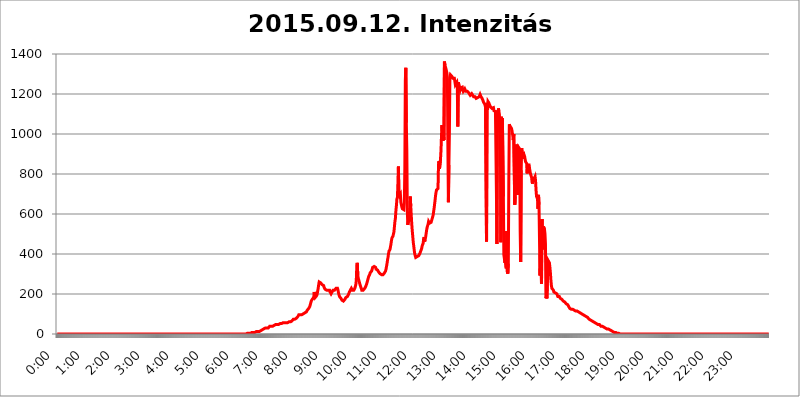
| Category | 2015.09.12. Intenzitás [W/m^2] |
|---|---|
| 0.0 | 0 |
| 0.0006944444444444445 | 0 |
| 0.001388888888888889 | 0 |
| 0.0020833333333333333 | 0 |
| 0.002777777777777778 | 0 |
| 0.003472222222222222 | 0 |
| 0.004166666666666667 | 0 |
| 0.004861111111111111 | 0 |
| 0.005555555555555556 | 0 |
| 0.0062499999999999995 | 0 |
| 0.006944444444444444 | 0 |
| 0.007638888888888889 | 0 |
| 0.008333333333333333 | 0 |
| 0.009027777777777779 | 0 |
| 0.009722222222222222 | 0 |
| 0.010416666666666666 | 0 |
| 0.011111111111111112 | 0 |
| 0.011805555555555555 | 0 |
| 0.012499999999999999 | 0 |
| 0.013194444444444444 | 0 |
| 0.013888888888888888 | 0 |
| 0.014583333333333332 | 0 |
| 0.015277777777777777 | 0 |
| 0.015972222222222224 | 0 |
| 0.016666666666666666 | 0 |
| 0.017361111111111112 | 0 |
| 0.018055555555555557 | 0 |
| 0.01875 | 0 |
| 0.019444444444444445 | 0 |
| 0.02013888888888889 | 0 |
| 0.020833333333333332 | 0 |
| 0.02152777777777778 | 0 |
| 0.022222222222222223 | 0 |
| 0.02291666666666667 | 0 |
| 0.02361111111111111 | 0 |
| 0.024305555555555556 | 0 |
| 0.024999999999999998 | 0 |
| 0.025694444444444447 | 0 |
| 0.02638888888888889 | 0 |
| 0.027083333333333334 | 0 |
| 0.027777777777777776 | 0 |
| 0.02847222222222222 | 0 |
| 0.029166666666666664 | 0 |
| 0.029861111111111113 | 0 |
| 0.030555555555555555 | 0 |
| 0.03125 | 0 |
| 0.03194444444444445 | 0 |
| 0.03263888888888889 | 0 |
| 0.03333333333333333 | 0 |
| 0.034027777777777775 | 0 |
| 0.034722222222222224 | 0 |
| 0.035416666666666666 | 0 |
| 0.036111111111111115 | 0 |
| 0.03680555555555556 | 0 |
| 0.0375 | 0 |
| 0.03819444444444444 | 0 |
| 0.03888888888888889 | 0 |
| 0.03958333333333333 | 0 |
| 0.04027777777777778 | 0 |
| 0.04097222222222222 | 0 |
| 0.041666666666666664 | 0 |
| 0.042361111111111106 | 0 |
| 0.04305555555555556 | 0 |
| 0.043750000000000004 | 0 |
| 0.044444444444444446 | 0 |
| 0.04513888888888889 | 0 |
| 0.04583333333333334 | 0 |
| 0.04652777777777778 | 0 |
| 0.04722222222222222 | 0 |
| 0.04791666666666666 | 0 |
| 0.04861111111111111 | 0 |
| 0.049305555555555554 | 0 |
| 0.049999999999999996 | 0 |
| 0.05069444444444445 | 0 |
| 0.051388888888888894 | 0 |
| 0.052083333333333336 | 0 |
| 0.05277777777777778 | 0 |
| 0.05347222222222222 | 0 |
| 0.05416666666666667 | 0 |
| 0.05486111111111111 | 0 |
| 0.05555555555555555 | 0 |
| 0.05625 | 0 |
| 0.05694444444444444 | 0 |
| 0.057638888888888885 | 0 |
| 0.05833333333333333 | 0 |
| 0.05902777777777778 | 0 |
| 0.059722222222222225 | 0 |
| 0.06041666666666667 | 0 |
| 0.061111111111111116 | 0 |
| 0.06180555555555556 | 0 |
| 0.0625 | 0 |
| 0.06319444444444444 | 0 |
| 0.06388888888888888 | 0 |
| 0.06458333333333334 | 0 |
| 0.06527777777777778 | 0 |
| 0.06597222222222222 | 0 |
| 0.06666666666666667 | 0 |
| 0.06736111111111111 | 0 |
| 0.06805555555555555 | 0 |
| 0.06874999999999999 | 0 |
| 0.06944444444444443 | 0 |
| 0.07013888888888889 | 0 |
| 0.07083333333333333 | 0 |
| 0.07152777777777779 | 0 |
| 0.07222222222222223 | 0 |
| 0.07291666666666667 | 0 |
| 0.07361111111111111 | 0 |
| 0.07430555555555556 | 0 |
| 0.075 | 0 |
| 0.07569444444444444 | 0 |
| 0.0763888888888889 | 0 |
| 0.07708333333333334 | 0 |
| 0.07777777777777778 | 0 |
| 0.07847222222222222 | 0 |
| 0.07916666666666666 | 0 |
| 0.0798611111111111 | 0 |
| 0.08055555555555556 | 0 |
| 0.08125 | 0 |
| 0.08194444444444444 | 0 |
| 0.08263888888888889 | 0 |
| 0.08333333333333333 | 0 |
| 0.08402777777777777 | 0 |
| 0.08472222222222221 | 0 |
| 0.08541666666666665 | 0 |
| 0.08611111111111112 | 0 |
| 0.08680555555555557 | 0 |
| 0.08750000000000001 | 0 |
| 0.08819444444444445 | 0 |
| 0.08888888888888889 | 0 |
| 0.08958333333333333 | 0 |
| 0.09027777777777778 | 0 |
| 0.09097222222222222 | 0 |
| 0.09166666666666667 | 0 |
| 0.09236111111111112 | 0 |
| 0.09305555555555556 | 0 |
| 0.09375 | 0 |
| 0.09444444444444444 | 0 |
| 0.09513888888888888 | 0 |
| 0.09583333333333333 | 0 |
| 0.09652777777777777 | 0 |
| 0.09722222222222222 | 0 |
| 0.09791666666666667 | 0 |
| 0.09861111111111111 | 0 |
| 0.09930555555555555 | 0 |
| 0.09999999999999999 | 0 |
| 0.10069444444444443 | 0 |
| 0.1013888888888889 | 0 |
| 0.10208333333333335 | 0 |
| 0.10277777777777779 | 0 |
| 0.10347222222222223 | 0 |
| 0.10416666666666667 | 0 |
| 0.10486111111111111 | 0 |
| 0.10555555555555556 | 0 |
| 0.10625 | 0 |
| 0.10694444444444444 | 0 |
| 0.1076388888888889 | 0 |
| 0.10833333333333334 | 0 |
| 0.10902777777777778 | 0 |
| 0.10972222222222222 | 0 |
| 0.1111111111111111 | 0 |
| 0.11180555555555556 | 0 |
| 0.11180555555555556 | 0 |
| 0.1125 | 0 |
| 0.11319444444444444 | 0 |
| 0.11388888888888889 | 0 |
| 0.11458333333333333 | 0 |
| 0.11527777777777777 | 0 |
| 0.11597222222222221 | 0 |
| 0.11666666666666665 | 0 |
| 0.1173611111111111 | 0 |
| 0.11805555555555557 | 0 |
| 0.11944444444444445 | 0 |
| 0.12013888888888889 | 0 |
| 0.12083333333333333 | 0 |
| 0.12152777777777778 | 0 |
| 0.12222222222222223 | 0 |
| 0.12291666666666667 | 0 |
| 0.12291666666666667 | 0 |
| 0.12361111111111112 | 0 |
| 0.12430555555555556 | 0 |
| 0.125 | 0 |
| 0.12569444444444444 | 0 |
| 0.12638888888888888 | 0 |
| 0.12708333333333333 | 0 |
| 0.16875 | 0 |
| 0.12847222222222224 | 0 |
| 0.12916666666666668 | 0 |
| 0.12986111111111112 | 0 |
| 0.13055555555555556 | 0 |
| 0.13125 | 0 |
| 0.13194444444444445 | 0 |
| 0.1326388888888889 | 0 |
| 0.13333333333333333 | 0 |
| 0.13402777777777777 | 0 |
| 0.13402777777777777 | 0 |
| 0.13472222222222222 | 0 |
| 0.13541666666666666 | 0 |
| 0.1361111111111111 | 0 |
| 0.13749999999999998 | 0 |
| 0.13819444444444443 | 0 |
| 0.1388888888888889 | 0 |
| 0.13958333333333334 | 0 |
| 0.14027777777777778 | 0 |
| 0.14097222222222222 | 0 |
| 0.14166666666666666 | 0 |
| 0.1423611111111111 | 0 |
| 0.14305555555555557 | 0 |
| 0.14375000000000002 | 0 |
| 0.14444444444444446 | 0 |
| 0.1451388888888889 | 0 |
| 0.1451388888888889 | 0 |
| 0.14652777777777778 | 0 |
| 0.14722222222222223 | 0 |
| 0.14791666666666667 | 0 |
| 0.1486111111111111 | 0 |
| 0.14930555555555555 | 0 |
| 0.15 | 0 |
| 0.15069444444444444 | 0 |
| 0.15138888888888888 | 0 |
| 0.15208333333333332 | 0 |
| 0.15277777777777776 | 0 |
| 0.15347222222222223 | 0 |
| 0.15416666666666667 | 0 |
| 0.15486111111111112 | 0 |
| 0.15555555555555556 | 0 |
| 0.15625 | 0 |
| 0.15694444444444444 | 0 |
| 0.15763888888888888 | 0 |
| 0.15833333333333333 | 0 |
| 0.15902777777777777 | 0 |
| 0.15972222222222224 | 0 |
| 0.16041666666666668 | 0 |
| 0.16111111111111112 | 0 |
| 0.16180555555555556 | 0 |
| 0.1625 | 0 |
| 0.16319444444444445 | 0 |
| 0.1638888888888889 | 0 |
| 0.16458333333333333 | 0 |
| 0.16527777777777777 | 0 |
| 0.16597222222222222 | 0 |
| 0.16666666666666666 | 0 |
| 0.1673611111111111 | 0 |
| 0.16805555555555554 | 0 |
| 0.16874999999999998 | 0 |
| 0.16944444444444443 | 0 |
| 0.17013888888888887 | 0 |
| 0.1708333333333333 | 0 |
| 0.17152777777777775 | 0 |
| 0.17222222222222225 | 0 |
| 0.1729166666666667 | 0 |
| 0.17361111111111113 | 0 |
| 0.17430555555555557 | 0 |
| 0.17500000000000002 | 0 |
| 0.17569444444444446 | 0 |
| 0.1763888888888889 | 0 |
| 0.17708333333333334 | 0 |
| 0.17777777777777778 | 0 |
| 0.17847222222222223 | 0 |
| 0.17916666666666667 | 0 |
| 0.1798611111111111 | 0 |
| 0.18055555555555555 | 0 |
| 0.18125 | 0 |
| 0.18194444444444444 | 0 |
| 0.1826388888888889 | 0 |
| 0.18333333333333335 | 0 |
| 0.1840277777777778 | 0 |
| 0.18472222222222223 | 0 |
| 0.18541666666666667 | 0 |
| 0.18611111111111112 | 0 |
| 0.18680555555555556 | 0 |
| 0.1875 | 0 |
| 0.18819444444444444 | 0 |
| 0.18888888888888888 | 0 |
| 0.18958333333333333 | 0 |
| 0.19027777777777777 | 0 |
| 0.1909722222222222 | 0 |
| 0.19166666666666665 | 0 |
| 0.19236111111111112 | 0 |
| 0.19305555555555554 | 0 |
| 0.19375 | 0 |
| 0.19444444444444445 | 0 |
| 0.1951388888888889 | 0 |
| 0.19583333333333333 | 0 |
| 0.19652777777777777 | 0 |
| 0.19722222222222222 | 0 |
| 0.19791666666666666 | 0 |
| 0.1986111111111111 | 0 |
| 0.19930555555555554 | 0 |
| 0.19999999999999998 | 0 |
| 0.20069444444444443 | 0 |
| 0.20138888888888887 | 0 |
| 0.2020833333333333 | 0 |
| 0.2027777777777778 | 0 |
| 0.2034722222222222 | 0 |
| 0.2041666666666667 | 0 |
| 0.20486111111111113 | 0 |
| 0.20555555555555557 | 0 |
| 0.20625000000000002 | 0 |
| 0.20694444444444446 | 0 |
| 0.2076388888888889 | 0 |
| 0.20833333333333334 | 0 |
| 0.20902777777777778 | 0 |
| 0.20972222222222223 | 0 |
| 0.21041666666666667 | 0 |
| 0.2111111111111111 | 0 |
| 0.21180555555555555 | 0 |
| 0.2125 | 0 |
| 0.21319444444444444 | 0 |
| 0.2138888888888889 | 0 |
| 0.21458333333333335 | 0 |
| 0.2152777777777778 | 0 |
| 0.21597222222222223 | 0 |
| 0.21666666666666667 | 0 |
| 0.21736111111111112 | 0 |
| 0.21805555555555556 | 0 |
| 0.21875 | 0 |
| 0.21944444444444444 | 0 |
| 0.22013888888888888 | 0 |
| 0.22083333333333333 | 0 |
| 0.22152777777777777 | 0 |
| 0.2222222222222222 | 0 |
| 0.22291666666666665 | 0 |
| 0.2236111111111111 | 0 |
| 0.22430555555555556 | 0 |
| 0.225 | 0 |
| 0.22569444444444445 | 0 |
| 0.2263888888888889 | 0 |
| 0.22708333333333333 | 0 |
| 0.22777777777777777 | 0 |
| 0.22847222222222222 | 0 |
| 0.22916666666666666 | 0 |
| 0.2298611111111111 | 0 |
| 0.23055555555555554 | 0 |
| 0.23124999999999998 | 0 |
| 0.23194444444444443 | 0 |
| 0.23263888888888887 | 0 |
| 0.2333333333333333 | 0 |
| 0.2340277777777778 | 0 |
| 0.2347222222222222 | 0 |
| 0.2354166666666667 | 0 |
| 0.23611111111111113 | 0 |
| 0.23680555555555557 | 0 |
| 0.23750000000000002 | 0 |
| 0.23819444444444446 | 0 |
| 0.2388888888888889 | 0 |
| 0.23958333333333334 | 0 |
| 0.24027777777777778 | 0 |
| 0.24097222222222223 | 0 |
| 0.24166666666666667 | 0 |
| 0.2423611111111111 | 0 |
| 0.24305555555555555 | 0 |
| 0.24375 | 0 |
| 0.24444444444444446 | 0 |
| 0.24513888888888888 | 0 |
| 0.24583333333333335 | 0 |
| 0.2465277777777778 | 0 |
| 0.24722222222222223 | 0 |
| 0.24791666666666667 | 0 |
| 0.24861111111111112 | 0 |
| 0.24930555555555556 | 0 |
| 0.25 | 0 |
| 0.25069444444444444 | 0 |
| 0.2513888888888889 | 0 |
| 0.2520833333333333 | 0 |
| 0.25277777777777777 | 0 |
| 0.2534722222222222 | 0 |
| 0.25416666666666665 | 0 |
| 0.2548611111111111 | 0 |
| 0.2555555555555556 | 0 |
| 0.25625000000000003 | 0 |
| 0.2569444444444445 | 0 |
| 0.2576388888888889 | 0 |
| 0.25833333333333336 | 0 |
| 0.2590277777777778 | 0 |
| 0.25972222222222224 | 0 |
| 0.2604166666666667 | 0 |
| 0.2611111111111111 | 0 |
| 0.26180555555555557 | 0 |
| 0.2625 | 0 |
| 0.26319444444444445 | 0 |
| 0.2638888888888889 | 0 |
| 0.26458333333333334 | 0 |
| 0.2652777777777778 | 0 |
| 0.2659722222222222 | 3.525 |
| 0.26666666666666666 | 3.525 |
| 0.2673611111111111 | 3.525 |
| 0.26805555555555555 | 3.525 |
| 0.26875 | 3.525 |
| 0.26944444444444443 | 3.525 |
| 0.2701388888888889 | 3.525 |
| 0.2708333333333333 | 3.525 |
| 0.27152777777777776 | 7.887 |
| 0.2722222222222222 | 7.887 |
| 0.27291666666666664 | 7.887 |
| 0.2736111111111111 | 7.887 |
| 0.2743055555555555 | 7.887 |
| 0.27499999999999997 | 7.887 |
| 0.27569444444444446 | 7.887 |
| 0.27638888888888885 | 7.887 |
| 0.27708333333333335 | 7.887 |
| 0.2777777777777778 | 12.257 |
| 0.27847222222222223 | 12.257 |
| 0.2791666666666667 | 12.257 |
| 0.2798611111111111 | 12.257 |
| 0.28055555555555556 | 12.257 |
| 0.28125 | 12.257 |
| 0.28194444444444444 | 12.257 |
| 0.2826388888888889 | 12.257 |
| 0.2833333333333333 | 12.257 |
| 0.28402777777777777 | 12.257 |
| 0.2847222222222222 | 16.636 |
| 0.28541666666666665 | 16.636 |
| 0.28611111111111115 | 21.024 |
| 0.28680555555555554 | 21.024 |
| 0.28750000000000003 | 21.024 |
| 0.2881944444444445 | 21.024 |
| 0.2888888888888889 | 25.419 |
| 0.28958333333333336 | 25.419 |
| 0.2902777777777778 | 25.419 |
| 0.29097222222222224 | 25.419 |
| 0.2916666666666667 | 29.823 |
| 0.2923611111111111 | 29.823 |
| 0.29305555555555557 | 29.823 |
| 0.29375 | 29.823 |
| 0.29444444444444445 | 29.823 |
| 0.2951388888888889 | 29.823 |
| 0.29583333333333334 | 29.823 |
| 0.2965277777777778 | 29.823 |
| 0.2972222222222222 | 34.234 |
| 0.29791666666666666 | 38.653 |
| 0.2986111111111111 | 38.653 |
| 0.29930555555555555 | 38.653 |
| 0.3 | 38.653 |
| 0.30069444444444443 | 38.653 |
| 0.3013888888888889 | 38.653 |
| 0.3020833333333333 | 38.653 |
| 0.30277777777777776 | 38.653 |
| 0.3034722222222222 | 43.079 |
| 0.30416666666666664 | 43.079 |
| 0.3048611111111111 | 47.511 |
| 0.3055555555555555 | 47.511 |
| 0.30624999999999997 | 47.511 |
| 0.3069444444444444 | 47.511 |
| 0.3076388888888889 | 47.511 |
| 0.30833333333333335 | 47.511 |
| 0.3090277777777778 | 47.511 |
| 0.30972222222222223 | 47.511 |
| 0.3104166666666667 | 47.511 |
| 0.3111111111111111 | 47.511 |
| 0.31180555555555556 | 47.511 |
| 0.3125 | 51.951 |
| 0.31319444444444444 | 51.951 |
| 0.3138888888888889 | 51.951 |
| 0.3145833333333333 | 51.951 |
| 0.31527777777777777 | 56.398 |
| 0.3159722222222222 | 56.398 |
| 0.31666666666666665 | 56.398 |
| 0.31736111111111115 | 56.398 |
| 0.31805555555555554 | 60.85 |
| 0.31875000000000003 | 56.398 |
| 0.3194444444444445 | 56.398 |
| 0.3201388888888889 | 56.398 |
| 0.32083333333333336 | 56.398 |
| 0.3215277777777778 | 56.398 |
| 0.32222222222222224 | 56.398 |
| 0.3229166666666667 | 56.398 |
| 0.3236111111111111 | 56.398 |
| 0.32430555555555557 | 60.85 |
| 0.325 | 60.85 |
| 0.32569444444444445 | 60.85 |
| 0.3263888888888889 | 60.85 |
| 0.32708333333333334 | 60.85 |
| 0.3277777777777778 | 60.85 |
| 0.3284722222222222 | 65.31 |
| 0.32916666666666666 | 65.31 |
| 0.3298611111111111 | 69.775 |
| 0.33055555555555555 | 69.775 |
| 0.33125 | 74.246 |
| 0.33194444444444443 | 74.246 |
| 0.3326388888888889 | 74.246 |
| 0.3333333333333333 | 74.246 |
| 0.3340277777777778 | 78.722 |
| 0.3347222222222222 | 78.722 |
| 0.3354166666666667 | 78.722 |
| 0.3361111111111111 | 83.205 |
| 0.3368055555555556 | 83.205 |
| 0.33749999999999997 | 87.692 |
| 0.33819444444444446 | 92.184 |
| 0.33888888888888885 | 96.682 |
| 0.33958333333333335 | 96.682 |
| 0.34027777777777773 | 96.682 |
| 0.34097222222222223 | 96.682 |
| 0.3416666666666666 | 96.682 |
| 0.3423611111111111 | 96.682 |
| 0.3430555555555555 | 96.682 |
| 0.34375 | 96.682 |
| 0.3444444444444445 | 96.682 |
| 0.3451388888888889 | 101.184 |
| 0.3458333333333334 | 101.184 |
| 0.34652777777777777 | 101.184 |
| 0.34722222222222227 | 105.69 |
| 0.34791666666666665 | 105.69 |
| 0.34861111111111115 | 110.201 |
| 0.34930555555555554 | 110.201 |
| 0.35000000000000003 | 114.716 |
| 0.3506944444444444 | 119.235 |
| 0.3513888888888889 | 119.235 |
| 0.3520833333333333 | 123.758 |
| 0.3527777777777778 | 128.284 |
| 0.3534722222222222 | 128.284 |
| 0.3541666666666667 | 137.347 |
| 0.3548611111111111 | 146.423 |
| 0.35555555555555557 | 155.509 |
| 0.35625 | 164.605 |
| 0.35694444444444445 | 169.156 |
| 0.3576388888888889 | 173.709 |
| 0.35833333333333334 | 173.709 |
| 0.3590277777777778 | 173.709 |
| 0.3597222222222222 | 182.82 |
| 0.36041666666666666 | 210.182 |
| 0.3611111111111111 | 196.497 |
| 0.36180555555555555 | 182.82 |
| 0.3625 | 182.82 |
| 0.36319444444444443 | 182.82 |
| 0.3638888888888889 | 191.937 |
| 0.3645833333333333 | 201.058 |
| 0.3652777777777778 | 214.746 |
| 0.3659722222222222 | 228.436 |
| 0.3666666666666667 | 246.689 |
| 0.3673611111111111 | 260.373 |
| 0.3680555555555556 | 264.932 |
| 0.36874999999999997 | 264.932 |
| 0.36944444444444446 | 255.813 |
| 0.37013888888888885 | 251.251 |
| 0.37083333333333335 | 251.251 |
| 0.37152777777777773 | 246.689 |
| 0.37222222222222223 | 242.127 |
| 0.3729166666666666 | 242.127 |
| 0.3736111111111111 | 242.127 |
| 0.3743055555555555 | 233 |
| 0.375 | 228.436 |
| 0.3756944444444445 | 223.873 |
| 0.3763888888888889 | 223.873 |
| 0.3770833333333334 | 219.309 |
| 0.37777777777777777 | 219.309 |
| 0.37847222222222227 | 219.309 |
| 0.37916666666666665 | 219.309 |
| 0.37986111111111115 | 219.309 |
| 0.38055555555555554 | 219.309 |
| 0.38125000000000003 | 223.873 |
| 0.3819444444444444 | 219.309 |
| 0.3826388888888889 | 210.182 |
| 0.3833333333333333 | 205.62 |
| 0.3840277777777778 | 201.058 |
| 0.3847222222222222 | 205.62 |
| 0.3854166666666667 | 210.182 |
| 0.3861111111111111 | 214.746 |
| 0.38680555555555557 | 219.309 |
| 0.3875 | 214.746 |
| 0.38819444444444445 | 219.309 |
| 0.3888888888888889 | 219.309 |
| 0.38958333333333334 | 219.309 |
| 0.3902777777777778 | 223.873 |
| 0.3909722222222222 | 228.436 |
| 0.39166666666666666 | 228.436 |
| 0.3923611111111111 | 228.436 |
| 0.39305555555555555 | 228.436 |
| 0.39375 | 219.309 |
| 0.39444444444444443 | 205.62 |
| 0.3951388888888889 | 196.497 |
| 0.3958333333333333 | 187.378 |
| 0.3965277777777778 | 182.82 |
| 0.3972222222222222 | 182.82 |
| 0.3979166666666667 | 178.264 |
| 0.3986111111111111 | 173.709 |
| 0.3993055555555556 | 169.156 |
| 0.39999999999999997 | 164.605 |
| 0.40069444444444446 | 164.605 |
| 0.40138888888888885 | 164.605 |
| 0.40208333333333335 | 164.605 |
| 0.40277777777777773 | 169.156 |
| 0.40347222222222223 | 173.709 |
| 0.4041666666666666 | 178.264 |
| 0.4048611111111111 | 182.82 |
| 0.4055555555555555 | 182.82 |
| 0.40625 | 182.82 |
| 0.4069444444444445 | 187.378 |
| 0.4076388888888889 | 191.937 |
| 0.4083333333333334 | 196.497 |
| 0.40902777777777777 | 201.058 |
| 0.40972222222222227 | 210.182 |
| 0.41041666666666665 | 214.746 |
| 0.41111111111111115 | 219.309 |
| 0.41180555555555554 | 223.873 |
| 0.41250000000000003 | 228.436 |
| 0.4131944444444444 | 223.873 |
| 0.4138888888888889 | 219.309 |
| 0.4145833333333333 | 219.309 |
| 0.4152777777777778 | 219.309 |
| 0.4159722222222222 | 219.309 |
| 0.4166666666666667 | 223.873 |
| 0.4173611111111111 | 228.436 |
| 0.41805555555555557 | 237.564 |
| 0.41875 | 246.689 |
| 0.41944444444444445 | 269.49 |
| 0.4201388888888889 | 342.162 |
| 0.42083333333333334 | 355.712 |
| 0.4215277777777778 | 292.259 |
| 0.4222222222222222 | 278.603 |
| 0.42291666666666666 | 269.49 |
| 0.4236111111111111 | 264.932 |
| 0.42430555555555555 | 251.251 |
| 0.425 | 242.127 |
| 0.42569444444444443 | 237.564 |
| 0.4263888888888889 | 228.436 |
| 0.4270833333333333 | 219.309 |
| 0.4277777777777778 | 214.746 |
| 0.4284722222222222 | 214.746 |
| 0.4291666666666667 | 219.309 |
| 0.4298611111111111 | 219.309 |
| 0.4305555555555556 | 223.873 |
| 0.43124999999999997 | 228.436 |
| 0.43194444444444446 | 228.436 |
| 0.43263888888888885 | 237.564 |
| 0.43333333333333335 | 242.127 |
| 0.43402777777777773 | 251.251 |
| 0.43472222222222223 | 260.373 |
| 0.4354166666666666 | 269.49 |
| 0.4361111111111111 | 278.603 |
| 0.4368055555555555 | 287.709 |
| 0.4375 | 287.709 |
| 0.4381944444444445 | 296.808 |
| 0.4388888888888889 | 305.898 |
| 0.4395833333333334 | 305.898 |
| 0.44027777777777777 | 310.44 |
| 0.44097222222222227 | 314.98 |
| 0.44166666666666665 | 324.052 |
| 0.44236111111111115 | 333.113 |
| 0.44305555555555554 | 333.113 |
| 0.44375000000000003 | 333.113 |
| 0.4444444444444444 | 337.639 |
| 0.4451388888888889 | 337.639 |
| 0.4458333333333333 | 333.113 |
| 0.4465277777777778 | 333.113 |
| 0.4472222222222222 | 324.052 |
| 0.4479166666666667 | 324.052 |
| 0.4486111111111111 | 324.052 |
| 0.44930555555555557 | 319.517 |
| 0.45 | 314.98 |
| 0.45069444444444445 | 310.44 |
| 0.4513888888888889 | 305.898 |
| 0.45208333333333334 | 305.898 |
| 0.4527777777777778 | 301.354 |
| 0.4534722222222222 | 301.354 |
| 0.45416666666666666 | 296.808 |
| 0.4548611111111111 | 296.808 |
| 0.45555555555555555 | 296.808 |
| 0.45625 | 296.808 |
| 0.45694444444444443 | 296.808 |
| 0.4576388888888889 | 296.808 |
| 0.4583333333333333 | 301.354 |
| 0.4590277777777778 | 305.898 |
| 0.4597222222222222 | 310.44 |
| 0.4604166666666667 | 314.98 |
| 0.4611111111111111 | 324.052 |
| 0.4618055555555556 | 337.639 |
| 0.46249999999999997 | 351.198 |
| 0.46319444444444446 | 369.23 |
| 0.46388888888888885 | 382.715 |
| 0.46458333333333335 | 400.638 |
| 0.46527777777777773 | 414.035 |
| 0.46597222222222223 | 418.492 |
| 0.4666666666666666 | 422.943 |
| 0.4673611111111111 | 436.27 |
| 0.4680555555555555 | 449.551 |
| 0.46875 | 467.187 |
| 0.4694444444444445 | 480.356 |
| 0.4701388888888889 | 484.735 |
| 0.4708333333333334 | 489.108 |
| 0.47152777777777777 | 493.475 |
| 0.47222222222222227 | 510.885 |
| 0.47291666666666665 | 536.82 |
| 0.47361111111111115 | 562.53 |
| 0.47430555555555554 | 579.542 |
| 0.47500000000000003 | 617.436 |
| 0.4756944444444444 | 642.4 |
| 0.4763888888888889 | 675.311 |
| 0.4770833333333333 | 683.473 |
| 0.4777777777777778 | 751.803 |
| 0.4784722222222222 | 837.682 |
| 0.4791666666666667 | 699.717 |
| 0.4798611111111111 | 691.608 |
| 0.48055555555555557 | 687.544 |
| 0.48125 | 699.717 |
| 0.48194444444444445 | 658.909 |
| 0.4826388888888889 | 646.537 |
| 0.48333333333333334 | 634.105 |
| 0.4840277777777778 | 625.784 |
| 0.4847222222222222 | 625.784 |
| 0.48541666666666666 | 621.613 |
| 0.4861111111111111 | 621.613 |
| 0.48680555555555555 | 654.791 |
| 0.4875 | 829.981 |
| 0.48819444444444443 | 1266.8 |
| 0.4888888888888889 | 1330.826 |
| 0.4895833333333333 | 1056.004 |
| 0.4902777777777778 | 921.298 |
| 0.4909722222222222 | 617.436 |
| 0.4916666666666667 | 545.416 |
| 0.4923611111111111 | 541.121 |
| 0.4930555555555556 | 575.299 |
| 0.49374999999999997 | 571.049 |
| 0.49444444444444446 | 617.436 |
| 0.49513888888888885 | 687.544 |
| 0.49583333333333335 | 638.256 |
| 0.49652777777777773 | 592.233 |
| 0.49722222222222223 | 549.704 |
| 0.4979166666666666 | 515.223 |
| 0.4986111111111111 | 489.108 |
| 0.4993055555555555 | 458.38 |
| 0.5 | 440.702 |
| 0.5006944444444444 | 418.492 |
| 0.5013888888888889 | 400.638 |
| 0.5020833333333333 | 391.685 |
| 0.5027777777777778 | 382.715 |
| 0.5034722222222222 | 382.715 |
| 0.5041666666666667 | 382.715 |
| 0.5048611111111111 | 387.202 |
| 0.5055555555555555 | 391.685 |
| 0.50625 | 391.685 |
| 0.5069444444444444 | 391.685 |
| 0.5076388888888889 | 396.164 |
| 0.5083333333333333 | 400.638 |
| 0.5090277777777777 | 405.108 |
| 0.5097222222222222 | 414.035 |
| 0.5104166666666666 | 418.492 |
| 0.5111111111111112 | 427.39 |
| 0.5118055555555555 | 440.702 |
| 0.5125000000000001 | 445.129 |
| 0.5131944444444444 | 453.968 |
| 0.513888888888889 | 475.972 |
| 0.5145833333333333 | 484.735 |
| 0.5152777777777778 | 462.786 |
| 0.5159722222222222 | 471.582 |
| 0.5166666666666667 | 484.735 |
| 0.517361111111111 | 502.192 |
| 0.5180555555555556 | 519.555 |
| 0.5187499999999999 | 532.513 |
| 0.5194444444444445 | 536.82 |
| 0.5201388888888888 | 549.704 |
| 0.5208333333333334 | 562.53 |
| 0.5215277777777778 | 562.53 |
| 0.5222222222222223 | 553.986 |
| 0.5229166666666667 | 553.986 |
| 0.5236111111111111 | 553.986 |
| 0.5243055555555556 | 558.261 |
| 0.525 | 566.793 |
| 0.5256944444444445 | 575.299 |
| 0.5263888888888889 | 583.779 |
| 0.5270833333333333 | 592.233 |
| 0.5277777777777778 | 609.062 |
| 0.5284722222222222 | 625.784 |
| 0.5291666666666667 | 646.537 |
| 0.5298611111111111 | 667.123 |
| 0.5305555555555556 | 691.608 |
| 0.53125 | 707.8 |
| 0.5319444444444444 | 719.877 |
| 0.5326388888888889 | 719.877 |
| 0.5333333333333333 | 719.877 |
| 0.5340277777777778 | 727.896 |
| 0.5347222222222222 | 845.365 |
| 0.5354166666666667 | 864.493 |
| 0.5361111111111111 | 826.123 |
| 0.5368055555555555 | 826.123 |
| 0.5375 | 872.114 |
| 0.5381944444444444 | 917.534 |
| 0.5388888888888889 | 988.714 |
| 0.5395833333333333 | 1044.762 |
| 0.5402777777777777 | 1041.019 |
| 0.5409722222222222 | 966.295 |
| 0.5416666666666666 | 992.448 |
| 0.5423611111111112 | 970.034 |
| 0.5430555555555555 | 1361.991 |
| 0.5437500000000001 | 1344.072 |
| 0.5444444444444444 | 1335.223 |
| 0.545138888888889 | 1326.445 |
| 0.5458333333333333 | 1322.082 |
| 0.5465277777777778 | 1304.795 |
| 0.5472222222222222 | 1275.142 |
| 0.5479166666666667 | 925.06 |
| 0.548611111111111 | 658.909 |
| 0.5493055555555556 | 845.365 |
| 0.5499999999999999 | 1007.383 |
| 0.5506944444444445 | 1283.541 |
| 0.5513888888888888 | 1296.248 |
| 0.5520833333333334 | 1291.997 |
| 0.5527777777777778 | 1291.997 |
| 0.5534722222222223 | 1287.761 |
| 0.5541666666666667 | 1283.541 |
| 0.5548611111111111 | 1279.334 |
| 0.5555555555555556 | 1275.142 |
| 0.55625 | 1279.334 |
| 0.5569444444444445 | 1279.334 |
| 0.5576388888888889 | 1279.334 |
| 0.5583333333333333 | 1246.176 |
| 0.5590277777777778 | 1246.176 |
| 0.5597222222222222 | 1250.275 |
| 0.5604166666666667 | 1258.511 |
| 0.5611111111111111 | 1233.951 |
| 0.5618055555555556 | 1037.277 |
| 0.5625 | 1258.511 |
| 0.5631944444444444 | 1250.275 |
| 0.5638888888888889 | 1246.176 |
| 0.5645833333333333 | 1246.176 |
| 0.5652777777777778 | 1221.83 |
| 0.5659722222222222 | 1229.899 |
| 0.5666666666666667 | 1233.951 |
| 0.5673611111111111 | 1233.951 |
| 0.5680555555555555 | 1233.951 |
| 0.56875 | 1221.83 |
| 0.5694444444444444 | 1213.804 |
| 0.5701388888888889 | 1217.812 |
| 0.5708333333333333 | 1217.812 |
| 0.5715277777777777 | 1225.859 |
| 0.5722222222222222 | 1225.859 |
| 0.5729166666666666 | 1213.804 |
| 0.5736111111111112 | 1217.812 |
| 0.5743055555555555 | 1217.812 |
| 0.5750000000000001 | 1213.804 |
| 0.5756944444444444 | 1209.807 |
| 0.576388888888889 | 1209.807 |
| 0.5770833333333333 | 1205.82 |
| 0.5777777777777778 | 1201.843 |
| 0.5784722222222222 | 1201.843 |
| 0.5791666666666667 | 1193.918 |
| 0.579861111111111 | 1197.876 |
| 0.5805555555555556 | 1197.876 |
| 0.5812499999999999 | 1201.843 |
| 0.5819444444444445 | 1197.876 |
| 0.5826388888888888 | 1193.918 |
| 0.5833333333333334 | 1193.918 |
| 0.5840277777777778 | 1186.03 |
| 0.5847222222222223 | 1186.03 |
| 0.5854166666666667 | 1186.03 |
| 0.5861111111111111 | 1186.03 |
| 0.5868055555555556 | 1182.099 |
| 0.5875 | 1178.177 |
| 0.5881944444444445 | 1178.177 |
| 0.5888888888888889 | 1182.099 |
| 0.5895833333333333 | 1182.099 |
| 0.5902777777777778 | 1178.177 |
| 0.5909722222222222 | 1186.03 |
| 0.5916666666666667 | 1186.03 |
| 0.5923611111111111 | 1186.03 |
| 0.5930555555555556 | 1197.876 |
| 0.59375 | 1193.918 |
| 0.5944444444444444 | 1186.03 |
| 0.5951388888888889 | 1182.099 |
| 0.5958333333333333 | 1178.177 |
| 0.5965277777777778 | 1174.263 |
| 0.5972222222222222 | 1166.46 |
| 0.5979166666666667 | 1158.689 |
| 0.5986111111111111 | 1154.814 |
| 0.5993055555555555 | 1150.946 |
| 0.6 | 1143.232 |
| 0.6006944444444444 | 1150.946 |
| 0.6013888888888889 | 1154.814 |
| 0.6020833333333333 | 462.786 |
| 0.6027777777777777 | 1154.814 |
| 0.6034722222222222 | 1120.238 |
| 0.6041666666666666 | 1162.571 |
| 0.6048611111111112 | 1158.689 |
| 0.6055555555555555 | 1154.814 |
| 0.6062500000000001 | 1147.086 |
| 0.6069444444444444 | 1143.232 |
| 0.607638888888889 | 1135.543 |
| 0.6083333333333333 | 1131.708 |
| 0.6090277777777778 | 1135.543 |
| 0.6097222222222222 | 1127.879 |
| 0.6104166666666667 | 1127.879 |
| 0.611111111111111 | 1124.056 |
| 0.6118055555555556 | 1131.708 |
| 0.6124999999999999 | 1116.426 |
| 0.6131944444444445 | 1116.426 |
| 0.6138888888888888 | 1116.426 |
| 0.6145833333333334 | 1112.618 |
| 0.6152777777777778 | 1116.426 |
| 0.6159722222222223 | 703.762 |
| 0.6166666666666667 | 449.551 |
| 0.6173611111111111 | 1116.426 |
| 0.6180555555555556 | 1033.537 |
| 0.61875 | 1127.879 |
| 0.6194444444444445 | 1112.618 |
| 0.6201388888888889 | 1097.437 |
| 0.6208333333333333 | 1093.653 |
| 0.6215277777777778 | 966.295 |
| 0.6222222222222222 | 458.38 |
| 0.6229166666666667 | 1086.097 |
| 0.6236111111111111 | 759.723 |
| 0.6243055555555556 | 1078.555 |
| 0.625 | 1082.324 |
| 0.6256944444444444 | 687.544 |
| 0.6263888888888889 | 396.164 |
| 0.6270833333333333 | 378.224 |
| 0.6277777777777778 | 355.712 |
| 0.6284722222222222 | 369.23 |
| 0.6291666666666667 | 369.23 |
| 0.6298611111111111 | 328.584 |
| 0.6305555555555555 | 515.223 |
| 0.63125 | 310.44 |
| 0.6319444444444444 | 301.354 |
| 0.6326388888888889 | 351.198 |
| 0.6333333333333333 | 763.674 |
| 0.6340277777777777 | 1048.508 |
| 0.6347222222222222 | 1041.019 |
| 0.6354166666666666 | 1037.277 |
| 0.6361111111111112 | 1037.277 |
| 0.6368055555555555 | 1029.798 |
| 0.6375000000000001 | 1022.323 |
| 0.6381944444444444 | 1026.06 |
| 0.638888888888889 | 992.448 |
| 0.6395833333333333 | 970.034 |
| 0.6402777777777778 | 999.916 |
| 0.6409722222222222 | 999.916 |
| 0.6416666666666667 | 646.537 |
| 0.642361111111111 | 687.544 |
| 0.6430555555555556 | 739.877 |
| 0.6437499999999999 | 849.199 |
| 0.6444444444444445 | 947.58 |
| 0.6451388888888888 | 703.762 |
| 0.6458333333333334 | 695.666 |
| 0.6465277777777778 | 894.885 |
| 0.6472222222222223 | 932.576 |
| 0.6479166666666667 | 932.576 |
| 0.6486111111111111 | 925.06 |
| 0.6493055555555556 | 510.885 |
| 0.65 | 360.221 |
| 0.6506944444444445 | 818.392 |
| 0.6513888888888889 | 928.819 |
| 0.6520833333333333 | 925.06 |
| 0.6527777777777778 | 875.918 |
| 0.6534722222222222 | 909.996 |
| 0.6541666666666667 | 902.447 |
| 0.6548611111111111 | 894.885 |
| 0.6555555555555556 | 887.309 |
| 0.65625 | 872.114 |
| 0.6569444444444444 | 860.676 |
| 0.6576388888888889 | 860.676 |
| 0.6583333333333333 | 853.029 |
| 0.6590277777777778 | 802.868 |
| 0.6597222222222222 | 845.365 |
| 0.6604166666666667 | 849.199 |
| 0.6611111111111111 | 849.199 |
| 0.6618055555555555 | 845.365 |
| 0.6625 | 826.123 |
| 0.6631944444444444 | 810.641 |
| 0.6638888888888889 | 798.974 |
| 0.6645833333333333 | 798.974 |
| 0.6652777777777777 | 783.342 |
| 0.6659722222222222 | 759.723 |
| 0.6666666666666666 | 751.803 |
| 0.6673611111111111 | 783.342 |
| 0.6680555555555556 | 771.559 |
| 0.6687500000000001 | 767.62 |
| 0.6694444444444444 | 775.492 |
| 0.6701388888888888 | 787.258 |
| 0.6708333333333334 | 767.62 |
| 0.6715277777777778 | 719.877 |
| 0.6722222222222222 | 687.544 |
| 0.6729166666666666 | 687.544 |
| 0.6736111111111112 | 675.311 |
| 0.6743055555555556 | 625.784 |
| 0.6749999999999999 | 695.666 |
| 0.6756944444444444 | 646.537 |
| 0.6763888888888889 | 642.4 |
| 0.6770833333333334 | 292.259 |
| 0.6777777777777777 | 436.27 |
| 0.6784722222222223 | 333.113 |
| 0.6791666666666667 | 251.251 |
| 0.6798611111111111 | 575.299 |
| 0.6805555555555555 | 449.551 |
| 0.68125 | 422.943 |
| 0.6819444444444445 | 536.82 |
| 0.6826388888888889 | 541.121 |
| 0.6833333333333332 | 523.88 |
| 0.6840277777777778 | 502.192 |
| 0.6847222222222222 | 449.551 |
| 0.6854166666666667 | 178.264 |
| 0.686111111111111 | 187.378 |
| 0.6868055555555556 | 178.264 |
| 0.6875 | 178.264 |
| 0.6881944444444444 | 369.23 |
| 0.688888888888889 | 364.728 |
| 0.6895833333333333 | 369.23 |
| 0.6902777777777778 | 355.712 |
| 0.6909722222222222 | 333.113 |
| 0.6916666666666668 | 305.898 |
| 0.6923611111111111 | 269.49 |
| 0.6930555555555555 | 242.127 |
| 0.69375 | 228.436 |
| 0.6944444444444445 | 223.873 |
| 0.6951388888888889 | 223.873 |
| 0.6958333333333333 | 219.309 |
| 0.6965277777777777 | 210.182 |
| 0.6972222222222223 | 210.182 |
| 0.6979166666666666 | 210.182 |
| 0.6986111111111111 | 205.62 |
| 0.6993055555555556 | 205.62 |
| 0.7000000000000001 | 201.058 |
| 0.7006944444444444 | 201.058 |
| 0.7013888888888888 | 201.058 |
| 0.7020833333333334 | 187.378 |
| 0.7027777777777778 | 182.82 |
| 0.7034722222222222 | 182.82 |
| 0.7041666666666666 | 187.378 |
| 0.7048611111111112 | 182.82 |
| 0.7055555555555556 | 178.264 |
| 0.7062499999999999 | 178.264 |
| 0.7069444444444444 | 173.709 |
| 0.7076388888888889 | 173.709 |
| 0.7083333333333334 | 169.156 |
| 0.7090277777777777 | 169.156 |
| 0.7097222222222223 | 164.605 |
| 0.7104166666666667 | 164.605 |
| 0.7111111111111111 | 160.056 |
| 0.7118055555555555 | 160.056 |
| 0.7125 | 160.056 |
| 0.7131944444444445 | 155.509 |
| 0.7138888888888889 | 150.964 |
| 0.7145833333333332 | 150.964 |
| 0.7152777777777778 | 146.423 |
| 0.7159722222222222 | 146.423 |
| 0.7166666666666667 | 141.884 |
| 0.717361111111111 | 137.347 |
| 0.7180555555555556 | 132.814 |
| 0.71875 | 128.284 |
| 0.7194444444444444 | 128.284 |
| 0.720138888888889 | 128.284 |
| 0.7208333333333333 | 123.758 |
| 0.7215277777777778 | 123.758 |
| 0.7222222222222222 | 123.758 |
| 0.7229166666666668 | 123.758 |
| 0.7236111111111111 | 123.758 |
| 0.7243055555555555 | 119.235 |
| 0.725 | 119.235 |
| 0.7256944444444445 | 119.235 |
| 0.7263888888888889 | 114.716 |
| 0.7270833333333333 | 114.716 |
| 0.7277777777777777 | 114.716 |
| 0.7284722222222223 | 114.716 |
| 0.7291666666666666 | 114.716 |
| 0.7298611111111111 | 110.201 |
| 0.7305555555555556 | 110.201 |
| 0.7312500000000001 | 110.201 |
| 0.7319444444444444 | 110.201 |
| 0.7326388888888888 | 110.201 |
| 0.7333333333333334 | 105.69 |
| 0.7340277777777778 | 105.69 |
| 0.7347222222222222 | 105.69 |
| 0.7354166666666666 | 101.184 |
| 0.7361111111111112 | 101.184 |
| 0.7368055555555556 | 101.184 |
| 0.7374999999999999 | 96.682 |
| 0.7381944444444444 | 96.682 |
| 0.7388888888888889 | 96.682 |
| 0.7395833333333334 | 92.184 |
| 0.7402777777777777 | 92.184 |
| 0.7409722222222223 | 87.692 |
| 0.7416666666666667 | 87.692 |
| 0.7423611111111111 | 87.692 |
| 0.7430555555555555 | 83.205 |
| 0.74375 | 83.205 |
| 0.7444444444444445 | 78.722 |
| 0.7451388888888889 | 78.722 |
| 0.7458333333333332 | 74.246 |
| 0.7465277777777778 | 69.775 |
| 0.7472222222222222 | 69.775 |
| 0.7479166666666667 | 69.775 |
| 0.748611111111111 | 65.31 |
| 0.7493055555555556 | 65.31 |
| 0.75 | 65.31 |
| 0.7506944444444444 | 65.31 |
| 0.751388888888889 | 65.31 |
| 0.7520833333333333 | 60.85 |
| 0.7527777777777778 | 56.398 |
| 0.7534722222222222 | 56.398 |
| 0.7541666666666668 | 56.398 |
| 0.7548611111111111 | 56.398 |
| 0.7555555555555555 | 56.398 |
| 0.75625 | 51.951 |
| 0.7569444444444445 | 51.951 |
| 0.7576388888888889 | 51.951 |
| 0.7583333333333333 | 47.511 |
| 0.7590277777777777 | 47.511 |
| 0.7597222222222223 | 47.511 |
| 0.7604166666666666 | 47.511 |
| 0.7611111111111111 | 43.079 |
| 0.7618055555555556 | 43.079 |
| 0.7625000000000001 | 38.653 |
| 0.7631944444444444 | 38.653 |
| 0.7638888888888888 | 38.653 |
| 0.7645833333333334 | 38.653 |
| 0.7652777777777778 | 34.234 |
| 0.7659722222222222 | 34.234 |
| 0.7666666666666666 | 34.234 |
| 0.7673611111111112 | 29.823 |
| 0.7680555555555556 | 29.823 |
| 0.7687499999999999 | 29.823 |
| 0.7694444444444444 | 29.823 |
| 0.7701388888888889 | 25.419 |
| 0.7708333333333334 | 25.419 |
| 0.7715277777777777 | 25.419 |
| 0.7722222222222223 | 25.419 |
| 0.7729166666666667 | 25.419 |
| 0.7736111111111111 | 21.024 |
| 0.7743055555555555 | 21.024 |
| 0.775 | 21.024 |
| 0.7756944444444445 | 21.024 |
| 0.7763888888888889 | 16.636 |
| 0.7770833333333332 | 16.636 |
| 0.7777777777777778 | 16.636 |
| 0.7784722222222222 | 16.636 |
| 0.7791666666666667 | 12.257 |
| 0.779861111111111 | 12.257 |
| 0.7805555555555556 | 12.257 |
| 0.78125 | 7.887 |
| 0.7819444444444444 | 7.887 |
| 0.782638888888889 | 7.887 |
| 0.7833333333333333 | 7.887 |
| 0.7840277777777778 | 3.525 |
| 0.7847222222222222 | 3.525 |
| 0.7854166666666668 | 3.525 |
| 0.7861111111111111 | 3.525 |
| 0.7868055555555555 | 3.525 |
| 0.7875 | 3.525 |
| 0.7881944444444445 | 3.525 |
| 0.7888888888888889 | 0 |
| 0.7895833333333333 | 0 |
| 0.7902777777777777 | 0 |
| 0.7909722222222223 | 0 |
| 0.7916666666666666 | 0 |
| 0.7923611111111111 | 0 |
| 0.7930555555555556 | 0 |
| 0.7937500000000001 | 0 |
| 0.7944444444444444 | 0 |
| 0.7951388888888888 | 0 |
| 0.7958333333333334 | 0 |
| 0.7965277777777778 | 0 |
| 0.7972222222222222 | 0 |
| 0.7979166666666666 | 0 |
| 0.7986111111111112 | 0 |
| 0.7993055555555556 | 0 |
| 0.7999999999999999 | 0 |
| 0.8006944444444444 | 0 |
| 0.8013888888888889 | 0 |
| 0.8020833333333334 | 0 |
| 0.8027777777777777 | 0 |
| 0.8034722222222223 | 0 |
| 0.8041666666666667 | 0 |
| 0.8048611111111111 | 0 |
| 0.8055555555555555 | 0 |
| 0.80625 | 0 |
| 0.8069444444444445 | 0 |
| 0.8076388888888889 | 0 |
| 0.8083333333333332 | 0 |
| 0.8090277777777778 | 0 |
| 0.8097222222222222 | 0 |
| 0.8104166666666667 | 0 |
| 0.811111111111111 | 0 |
| 0.8118055555555556 | 0 |
| 0.8125 | 0 |
| 0.8131944444444444 | 0 |
| 0.813888888888889 | 0 |
| 0.8145833333333333 | 0 |
| 0.8152777777777778 | 0 |
| 0.8159722222222222 | 0 |
| 0.8166666666666668 | 0 |
| 0.8173611111111111 | 0 |
| 0.8180555555555555 | 0 |
| 0.81875 | 0 |
| 0.8194444444444445 | 0 |
| 0.8201388888888889 | 0 |
| 0.8208333333333333 | 0 |
| 0.8215277777777777 | 0 |
| 0.8222222222222223 | 0 |
| 0.8229166666666666 | 0 |
| 0.8236111111111111 | 0 |
| 0.8243055555555556 | 0 |
| 0.8250000000000001 | 0 |
| 0.8256944444444444 | 0 |
| 0.8263888888888888 | 0 |
| 0.8270833333333334 | 0 |
| 0.8277777777777778 | 0 |
| 0.8284722222222222 | 0 |
| 0.8291666666666666 | 0 |
| 0.8298611111111112 | 0 |
| 0.8305555555555556 | 0 |
| 0.8312499999999999 | 0 |
| 0.8319444444444444 | 0 |
| 0.8326388888888889 | 0 |
| 0.8333333333333334 | 0 |
| 0.8340277777777777 | 0 |
| 0.8347222222222223 | 0 |
| 0.8354166666666667 | 0 |
| 0.8361111111111111 | 0 |
| 0.8368055555555555 | 0 |
| 0.8375 | 0 |
| 0.8381944444444445 | 0 |
| 0.8388888888888889 | 0 |
| 0.8395833333333332 | 0 |
| 0.8402777777777778 | 0 |
| 0.8409722222222222 | 0 |
| 0.8416666666666667 | 0 |
| 0.842361111111111 | 0 |
| 0.8430555555555556 | 0 |
| 0.84375 | 0 |
| 0.8444444444444444 | 0 |
| 0.845138888888889 | 0 |
| 0.8458333333333333 | 0 |
| 0.8465277777777778 | 0 |
| 0.8472222222222222 | 0 |
| 0.8479166666666668 | 0 |
| 0.8486111111111111 | 0 |
| 0.8493055555555555 | 0 |
| 0.85 | 0 |
| 0.8506944444444445 | 0 |
| 0.8513888888888889 | 0 |
| 0.8520833333333333 | 0 |
| 0.8527777777777777 | 0 |
| 0.8534722222222223 | 0 |
| 0.8541666666666666 | 0 |
| 0.8548611111111111 | 0 |
| 0.8555555555555556 | 0 |
| 0.8562500000000001 | 0 |
| 0.8569444444444444 | 0 |
| 0.8576388888888888 | 0 |
| 0.8583333333333334 | 0 |
| 0.8590277777777778 | 0 |
| 0.8597222222222222 | 0 |
| 0.8604166666666666 | 0 |
| 0.8611111111111112 | 0 |
| 0.8618055555555556 | 0 |
| 0.8624999999999999 | 0 |
| 0.8631944444444444 | 0 |
| 0.8638888888888889 | 0 |
| 0.8645833333333334 | 0 |
| 0.8652777777777777 | 0 |
| 0.8659722222222223 | 0 |
| 0.8666666666666667 | 0 |
| 0.8673611111111111 | 0 |
| 0.8680555555555555 | 0 |
| 0.86875 | 0 |
| 0.8694444444444445 | 0 |
| 0.8701388888888889 | 0 |
| 0.8708333333333332 | 0 |
| 0.8715277777777778 | 0 |
| 0.8722222222222222 | 0 |
| 0.8729166666666667 | 0 |
| 0.873611111111111 | 0 |
| 0.8743055555555556 | 0 |
| 0.875 | 0 |
| 0.8756944444444444 | 0 |
| 0.876388888888889 | 0 |
| 0.8770833333333333 | 0 |
| 0.8777777777777778 | 0 |
| 0.8784722222222222 | 0 |
| 0.8791666666666668 | 0 |
| 0.8798611111111111 | 0 |
| 0.8805555555555555 | 0 |
| 0.88125 | 0 |
| 0.8819444444444445 | 0 |
| 0.8826388888888889 | 0 |
| 0.8833333333333333 | 0 |
| 0.8840277777777777 | 0 |
| 0.8847222222222223 | 0 |
| 0.8854166666666666 | 0 |
| 0.8861111111111111 | 0 |
| 0.8868055555555556 | 0 |
| 0.8875000000000001 | 0 |
| 0.8881944444444444 | 0 |
| 0.8888888888888888 | 0 |
| 0.8895833333333334 | 0 |
| 0.8902777777777778 | 0 |
| 0.8909722222222222 | 0 |
| 0.8916666666666666 | 0 |
| 0.8923611111111112 | 0 |
| 0.8930555555555556 | 0 |
| 0.8937499999999999 | 0 |
| 0.8944444444444444 | 0 |
| 0.8951388888888889 | 0 |
| 0.8958333333333334 | 0 |
| 0.8965277777777777 | 0 |
| 0.8972222222222223 | 0 |
| 0.8979166666666667 | 0 |
| 0.8986111111111111 | 0 |
| 0.8993055555555555 | 0 |
| 0.9 | 0 |
| 0.9006944444444445 | 0 |
| 0.9013888888888889 | 0 |
| 0.9020833333333332 | 0 |
| 0.9027777777777778 | 0 |
| 0.9034722222222222 | 0 |
| 0.9041666666666667 | 0 |
| 0.904861111111111 | 0 |
| 0.9055555555555556 | 0 |
| 0.90625 | 0 |
| 0.9069444444444444 | 0 |
| 0.907638888888889 | 0 |
| 0.9083333333333333 | 0 |
| 0.9090277777777778 | 0 |
| 0.9097222222222222 | 0 |
| 0.9104166666666668 | 0 |
| 0.9111111111111111 | 0 |
| 0.9118055555555555 | 0 |
| 0.9125 | 0 |
| 0.9131944444444445 | 0 |
| 0.9138888888888889 | 0 |
| 0.9145833333333333 | 0 |
| 0.9152777777777777 | 0 |
| 0.9159722222222223 | 0 |
| 0.9166666666666666 | 0 |
| 0.9173611111111111 | 0 |
| 0.9180555555555556 | 0 |
| 0.9187500000000001 | 0 |
| 0.9194444444444444 | 0 |
| 0.9201388888888888 | 0 |
| 0.9208333333333334 | 0 |
| 0.9215277777777778 | 0 |
| 0.9222222222222222 | 0 |
| 0.9229166666666666 | 0 |
| 0.9236111111111112 | 0 |
| 0.9243055555555556 | 0 |
| 0.9249999999999999 | 0 |
| 0.9256944444444444 | 0 |
| 0.9263888888888889 | 0 |
| 0.9270833333333334 | 0 |
| 0.9277777777777777 | 0 |
| 0.9284722222222223 | 0 |
| 0.9291666666666667 | 0 |
| 0.9298611111111111 | 0 |
| 0.9305555555555555 | 0 |
| 0.93125 | 0 |
| 0.9319444444444445 | 0 |
| 0.9326388888888889 | 0 |
| 0.9333333333333332 | 0 |
| 0.9340277777777778 | 0 |
| 0.9347222222222222 | 0 |
| 0.9354166666666667 | 0 |
| 0.936111111111111 | 0 |
| 0.9368055555555556 | 0 |
| 0.9375 | 0 |
| 0.9381944444444444 | 0 |
| 0.938888888888889 | 0 |
| 0.9395833333333333 | 0 |
| 0.9402777777777778 | 0 |
| 0.9409722222222222 | 0 |
| 0.9416666666666668 | 0 |
| 0.9423611111111111 | 0 |
| 0.9430555555555555 | 0 |
| 0.94375 | 0 |
| 0.9444444444444445 | 0 |
| 0.9451388888888889 | 0 |
| 0.9458333333333333 | 0 |
| 0.9465277777777777 | 0 |
| 0.9472222222222223 | 0 |
| 0.9479166666666666 | 0 |
| 0.9486111111111111 | 0 |
| 0.9493055555555556 | 0 |
| 0.9500000000000001 | 0 |
| 0.9506944444444444 | 0 |
| 0.9513888888888888 | 0 |
| 0.9520833333333334 | 0 |
| 0.9527777777777778 | 0 |
| 0.9534722222222222 | 0 |
| 0.9541666666666666 | 0 |
| 0.9548611111111112 | 0 |
| 0.9555555555555556 | 0 |
| 0.9562499999999999 | 0 |
| 0.9569444444444444 | 0 |
| 0.9576388888888889 | 0 |
| 0.9583333333333334 | 0 |
| 0.9590277777777777 | 0 |
| 0.9597222222222223 | 0 |
| 0.9604166666666667 | 0 |
| 0.9611111111111111 | 0 |
| 0.9618055555555555 | 0 |
| 0.9625 | 0 |
| 0.9631944444444445 | 0 |
| 0.9638888888888889 | 0 |
| 0.9645833333333332 | 0 |
| 0.9652777777777778 | 0 |
| 0.9659722222222222 | 0 |
| 0.9666666666666667 | 0 |
| 0.967361111111111 | 0 |
| 0.9680555555555556 | 0 |
| 0.96875 | 0 |
| 0.9694444444444444 | 0 |
| 0.970138888888889 | 0 |
| 0.9708333333333333 | 0 |
| 0.9715277777777778 | 0 |
| 0.9722222222222222 | 0 |
| 0.9729166666666668 | 0 |
| 0.9736111111111111 | 0 |
| 0.9743055555555555 | 0 |
| 0.975 | 0 |
| 0.9756944444444445 | 0 |
| 0.9763888888888889 | 0 |
| 0.9770833333333333 | 0 |
| 0.9777777777777777 | 0 |
| 0.9784722222222223 | 0 |
| 0.9791666666666666 | 0 |
| 0.9798611111111111 | 0 |
| 0.9805555555555556 | 0 |
| 0.9812500000000001 | 0 |
| 0.9819444444444444 | 0 |
| 0.9826388888888888 | 0 |
| 0.9833333333333334 | 0 |
| 0.9840277777777778 | 0 |
| 0.9847222222222222 | 0 |
| 0.9854166666666666 | 0 |
| 0.9861111111111112 | 0 |
| 0.9868055555555556 | 0 |
| 0.9874999999999999 | 0 |
| 0.9881944444444444 | 0 |
| 0.9888888888888889 | 0 |
| 0.9895833333333334 | 0 |
| 0.9902777777777777 | 0 |
| 0.9909722222222223 | 0 |
| 0.9916666666666667 | 0 |
| 0.9923611111111111 | 0 |
| 0.9930555555555555 | 0 |
| 0.99375 | 0 |
| 0.9944444444444445 | 0 |
| 0.9951388888888889 | 0 |
| 0.9958333333333332 | 0 |
| 0.9965277777777778 | 0 |
| 0.9972222222222222 | 0 |
| 0.9979166666666667 | 0 |
| 0.998611111111111 | 0 |
| 0.9993055555555556 | 0 |